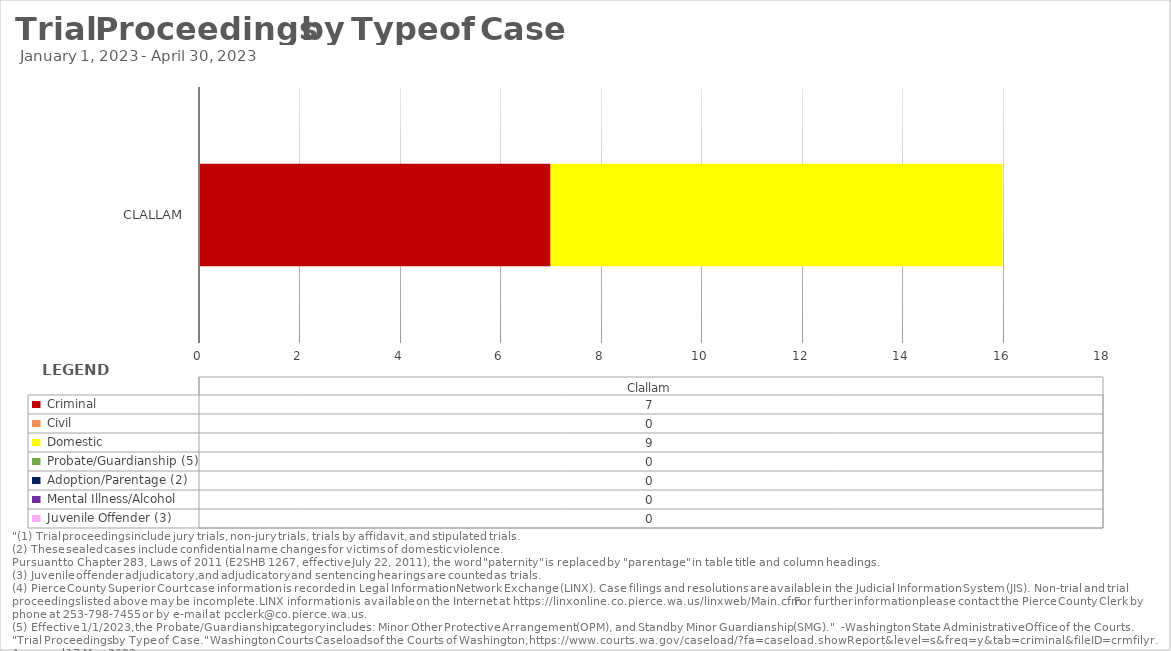
| Category |  Criminal  |  Civil  |  Domestic  |  Probate/Guardianship (5) |  Adoption/Parentage (2)  |  Mental Illness/Alcohol  |  Juvenile Offender (3)  |
|---|---|---|---|---|---|---|---|
| Clallam | 7 | 0 | 9 | 0 | 0 | 0 | 0 |